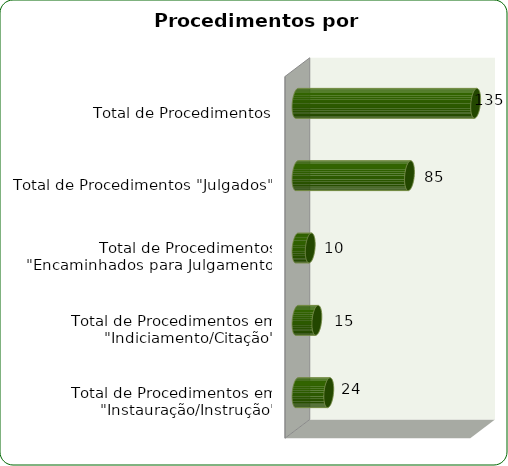
| Category | Série |
|---|---|
| Total de Procedimentos em "Instauração/Instrução" | 24 |
| Total de Procedimentos em "Indiciamento/Citação" | 15 |
| Total de Procedimentos "Encaminhados para Julgamento" | 10 |
| Total de Procedimentos "Julgados" | 85 |
| Total de Procedimentos | 135 |